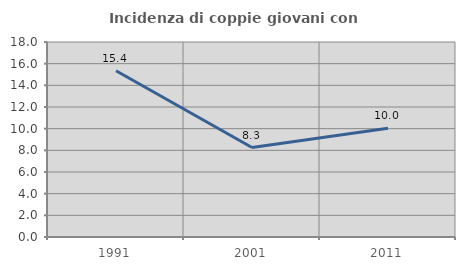
| Category | Incidenza di coppie giovani con figli |
|---|---|
| 1991.0 | 15.351 |
| 2001.0 | 8.257 |
| 2011.0 | 10.042 |